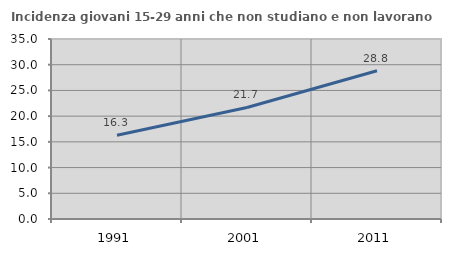
| Category | Incidenza giovani 15-29 anni che non studiano e non lavorano  |
|---|---|
| 1991.0 | 16.279 |
| 2001.0 | 21.687 |
| 2011.0 | 28.814 |